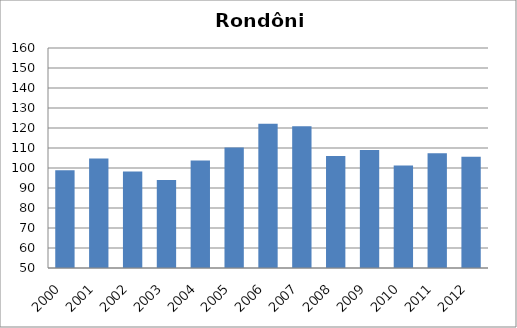
| Category | Poliomielite |
|---|---|
| 2000.0 | 98.82 |
| 2001.0 | 104.77 |
| 2002.0 | 98.27 |
| 2003.0 | 93.97 |
| 2004.0 | 103.75 |
| 2005.0 | 110.25 |
| 2006.0 | 122.13 |
| 2007.0 | 120.88 |
| 2008.0 | 105.98 |
| 2009.0 | 109.01 |
| 2010.0 | 101.2 |
| 2011.0 | 107.32 |
| 2012.0 | 105.68 |